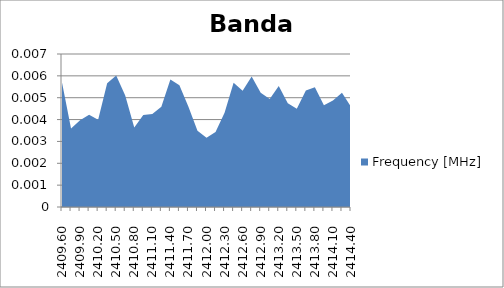
| Category | Frequency [MHz] |
|---|---|
| 2409.6 | 0.006 |
| 2409.75 | 0.004 |
| 2409.9 | 0.004 |
| 2410.05 | 0.004 |
| 2410.2 | 0.004 |
| 2410.35 | 0.006 |
| 2410.5 | 0.006 |
| 2410.65 | 0.005 |
| 2410.8 | 0.004 |
| 2410.95 | 0.004 |
| 2411.1 | 0.004 |
| 2411.25 | 0.005 |
| 2411.4 | 0.006 |
| 2411.55 | 0.006 |
| 2411.7 | 0.005 |
| 2411.85 | 0.003 |
| 2412.0 | 0.003 |
| 2412.15 | 0.003 |
| 2412.3 | 0.004 |
| 2412.45 | 0.006 |
| 2412.6 | 0.005 |
| 2412.75 | 0.006 |
| 2412.9 | 0.005 |
| 2413.05 | 0.005 |
| 2413.2 | 0.006 |
| 2413.35 | 0.005 |
| 2413.5 | 0.004 |
| 2413.65 | 0.005 |
| 2413.8 | 0.005 |
| 2413.95 | 0.005 |
| 2414.1 | 0.005 |
| 2414.25 | 0.005 |
| 2414.4 | 0.005 |